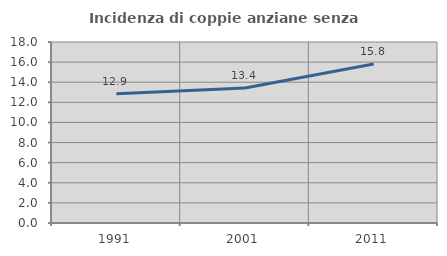
| Category | Incidenza di coppie anziane senza figli  |
|---|---|
| 1991.0 | 12.865 |
| 2001.0 | 13.418 |
| 2011.0 | 15.817 |